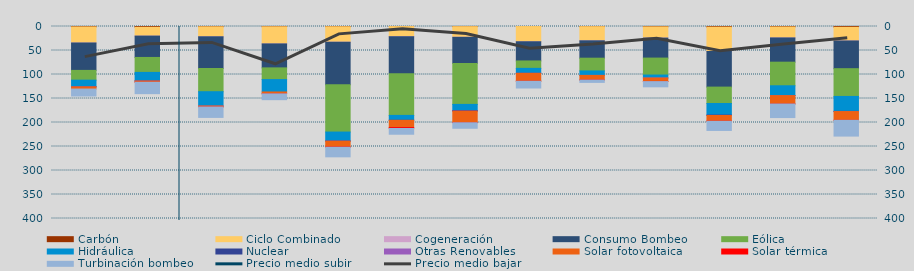
| Category | Carbón | Ciclo Combinado | Cogeneración | Consumo Bombeo | Eólica | Hidráulica | Nuclear | Otras Renovables | Solar fotovoltaica | Solar térmica | Turbinación bombeo |
|---|---|---|---|---|---|---|---|---|---|---|---|
| N | 882.249 | 33437.299 | 73.35 | 57054.7 | 20324.708 | 13802.882 | 172 | 5.375 | 4519.267 | 0 | 14514.075 |
| D | 1625.533 | 18353.308 | 50.675 | 44452.158 | 31169.809 | 17718.259 | 225.525 | 7.75 | 2457.35 | 4.225 | 23848.4 |
| E | 624.15 | 20714.774 | 137.817 | 66005.482 | 48358.133 | 29783.675 | 0 | 1 | 1942.858 | 28.625 | 21792.308 |
| F | 573.3 | 35710.625 | 48.25 | 49890.275 | 24355.325 | 25831 | 0 | 0 | 3780.125 | 69.225 | 12196.8 |
| M | 501.25 | 32124.392 | 164.517 | 88685.498 | 98417.968 | 18612.512 | 448.75 | 16.575 | 11880.15 | 572.625 | 20112.843 |
| A | 170 | 20766.184 | 571.725 | 76937.455 | 86761.121 | 10133.333 | 40.925 | 0 | 14988.025 | 2004.65 | 12082.525 |
| M | 320.375 | 21993.7 | 252.925 | 54297.65 | 85403.658 | 12766.317 | 1357.65 | 14.475 | 23573.033 | 453.85 | 11577.425 |
| J | 92.075 | 31710.184 | 28.017 | 39954.501 | 15416.333 | 10344.86 | 11.25 | 38.75 | 16255.675 | 192.1 | 14074.425 |
| J | 322.925 | 29487.87 | 56.5 | 36148.45 | 26555.431 | 9322.947 | 0 | 27.5 | 9428.357 | 218.775 | 4884.775 |
| A | 791.025 | 23383.803 | 61.5 | 41567.115 | 35359.804 | 6042.439 | 0 | 145.075 | 7086.59 | 334.925 | 10897.775 |
| S | 1345.508 | 50563.018 | 49 | 74303.001 | 34150.357 | 24005.525 | 791.75 | 160.275 | 11766.108 | 299.95 | 19108.925 |
| O | 964.4 | 22845.583 | 47.775 | 50475.258 | 49132.629 | 20329.391 | 212.725 | 38.5 | 17232.379 | 91.15 | 28366.325 |
| N | 1675.475 | 28385.494 | 112.05 | 57681.133 | 57832.261 | 31092.689 | 423.675 | 64.5 | 18121.278 | 19.725 | 32908.825 |